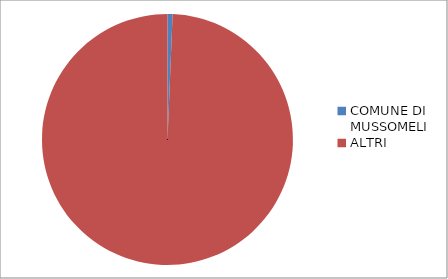
| Category | Series 0 |
|---|---|
| COMUNE DI MUSSOMELI | 0.65 |
| ALTRI | 99.35 |